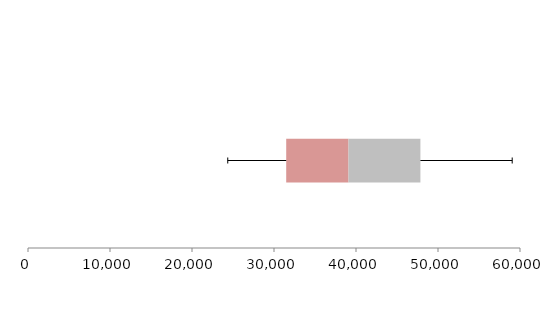
| Category | Series 1 | Series 2 | Series 3 |
|---|---|---|---|
| 0 | 31488.936 | 7598.878 | 8766.694 |